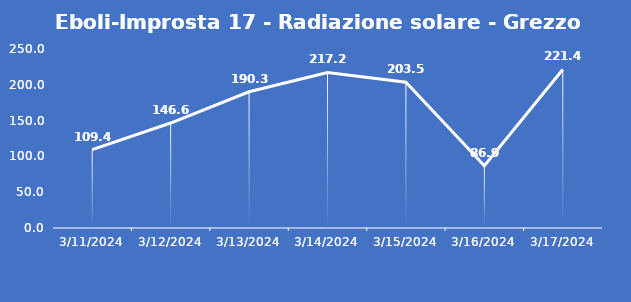
| Category | Eboli-Improsta 17 - Radiazione solare - Grezzo (W/m2) |
|---|---|
| 3/11/24 | 109.4 |
| 3/12/24 | 146.6 |
| 3/13/24 | 190.3 |
| 3/14/24 | 217.2 |
| 3/15/24 | 203.5 |
| 3/16/24 | 86.9 |
| 3/17/24 | 221.4 |